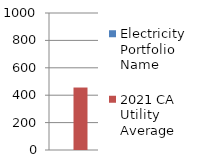
| Category | Electricity Portfolio Name | 2021 CA Utility Average |
|---|---|---|
| 0 | 0 | 456 |